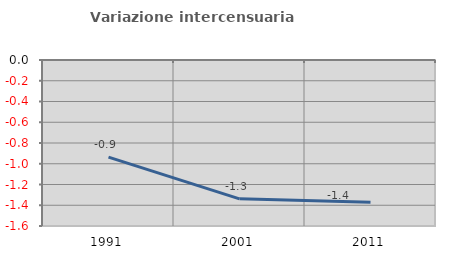
| Category | Variazione intercensuaria annua |
|---|---|
| 1991.0 | -0.937 |
| 2001.0 | -1.338 |
| 2011.0 | -1.372 |